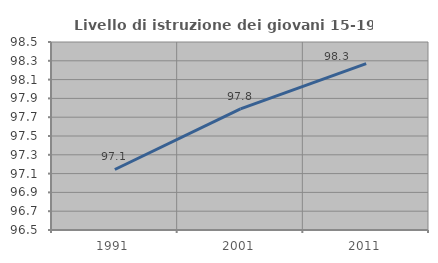
| Category | Livello di istruzione dei giovani 15-19 anni |
|---|---|
| 1991.0 | 97.144 |
| 2001.0 | 97.789 |
| 2011.0 | 98.27 |